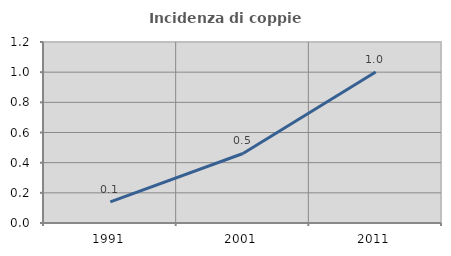
| Category | Incidenza di coppie miste |
|---|---|
| 1991.0 | 0.141 |
| 2001.0 | 0.461 |
| 2011.0 | 1.001 |